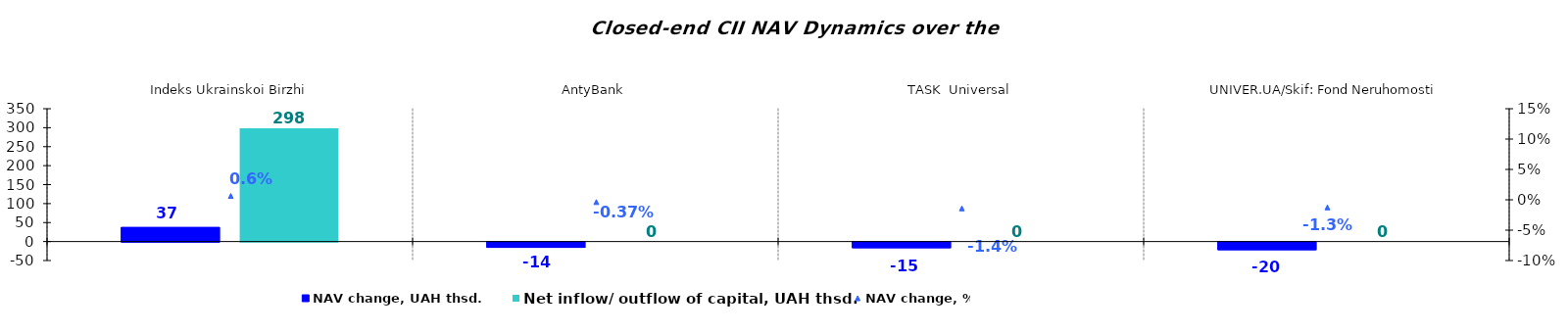
| Category | NAV change, UAH thsd. | Net inflow/ outflow of capital, UAH thsd. |
|---|---|---|
| Indeks Ukrainskoi Birzhi | 37.47 | 298.175 |
| AntyBank | -14.193 | 0 |
| TASK  Universal | -14.979 | 0 |
| UNIVER.UA/Skif: Fond Neruhomosti | -20.295 | 0 |